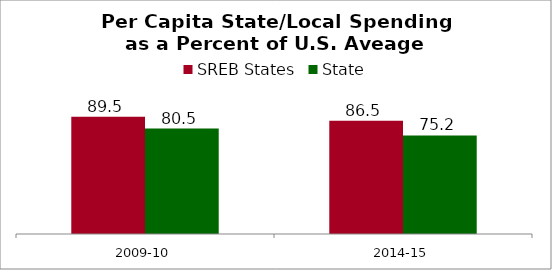
| Category | SREB States | State |
|---|---|---|
| 2009-10 | 89.495 | 80.495 |
| 2014-15 | 86.492 | 75.225 |